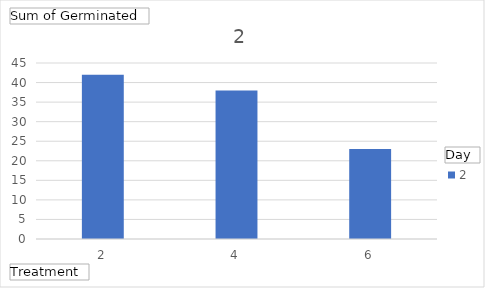
| Category | 2 |
|---|---|
| 2 | 42 |
| 4 | 38 |
| 6 | 23 |